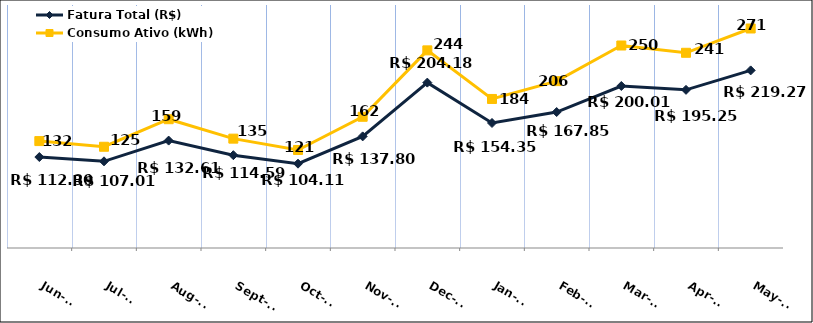
| Category | Fatura Total (R$) |
|---|---|
| 2023-06-01 | 112.3 |
| 2023-07-01 | 107.01 |
| 2023-08-01 | 132.61 |
| 2023-09-01 | 114.59 |
| 2023-10-01 | 104.11 |
| 2023-11-01 | 137.8 |
| 2023-12-01 | 204.18 |
| 2024-01-01 | 154.35 |
| 2024-02-01 | 167.85 |
| 2024-03-01 | 200.01 |
| 2024-04-01 | 195.25 |
| 2024-05-01 | 219.27 |